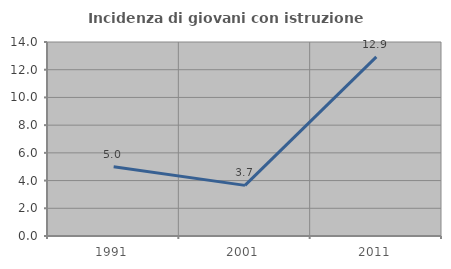
| Category | Incidenza di giovani con istruzione universitaria |
|---|---|
| 1991.0 | 5 |
| 2001.0 | 3.653 |
| 2011.0 | 12.931 |